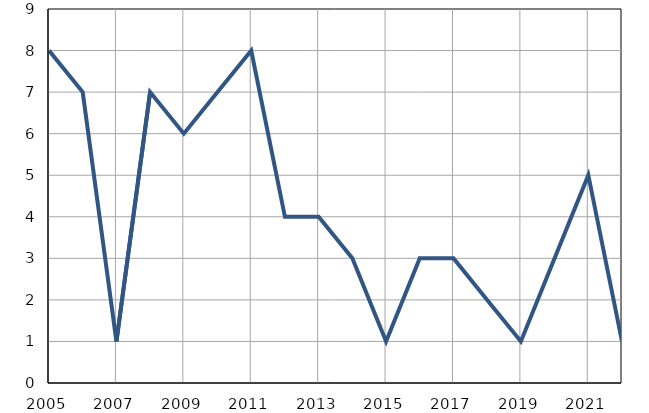
| Category | Умрла 
одојчад |
|---|---|
| 2005.0 | 8 |
| 2006.0 | 7 |
| 2007.0 | 1 |
| 2008.0 | 7 |
| 2009.0 | 6 |
| 2010.0 | 7 |
| 2011.0 | 8 |
| 2012.0 | 4 |
| 2013.0 | 4 |
| 2014.0 | 3 |
| 2015.0 | 1 |
| 2016.0 | 3 |
| 2017.0 | 3 |
| 2018.0 | 2 |
| 2019.0 | 1 |
| 2020.0 | 3 |
| 2021.0 | 5 |
| 2022.0 | 1 |